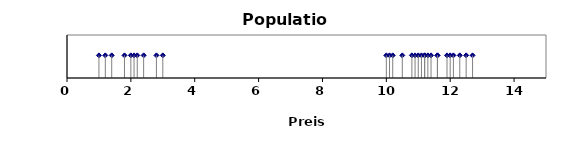
| Category | Series 0 |
|---|---|
| 1.0 | 1 |
| 1.2 | 1 |
| 1.4 | 1 |
| 1.8 | 1 |
| 2.0 | 1 |
| 2.1 | 1 |
| 2.2 | 1 |
| 2.4 | 1 |
| 2.8 | 1 |
| 3.0 | 1 |
| 10.0 | 1 |
| 10.1 | 1 |
| 10.2 | 1 |
| 10.5 | 1 |
| 10.8 | 1 |
| 10.9 | 1 |
| 11.0 | 1 |
| 11.2 | 1 |
| 11.4 | 1 |
| 11.6 | 1 |
| 11.1 | 1 |
| 11.2 | 1 |
| 11.3 | 1 |
| 11.6 | 1 |
| 11.9 | 1 |
| 12.0 | 1 |
| 12.1 | 1 |
| 12.3 | 1 |
| 12.5 | 1 |
| 12.7 | 1 |